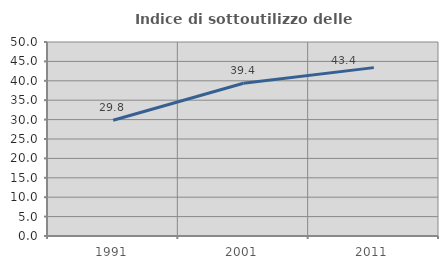
| Category | Indice di sottoutilizzo delle abitazioni  |
|---|---|
| 1991.0 | 29.844 |
| 2001.0 | 39.367 |
| 2011.0 | 43.396 |